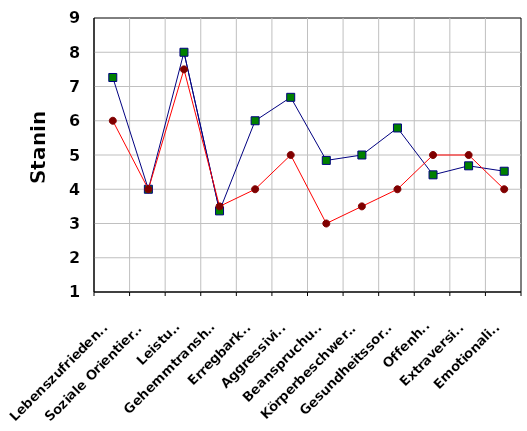
| Category | Bewerber-Gruppe | Experten-Profilvorgabe |
|---|---|---|
| Lebenszufriedenheit | 7.263 | 6 |
| Soziale Orientierung | 4 | 4 |
| Leistung | 8 | 7.5 |
| Gehemmtransheit | 3.368 | 3.5 |
| Erregbarkeit | 6 | 4 |
| Aggressivität | 6.684 | 5 |
| Beanspruchung | 4.842 | 3 |
| Körperbeschwerden | 5 | 3.5 |
| Gesundheitssorgen | 5.789 | 4 |
| Offenheit | 4.421 | 5 |
| Extraversion | 4.684 | 5 |
| Emotionalität | 4.526 | 4 |